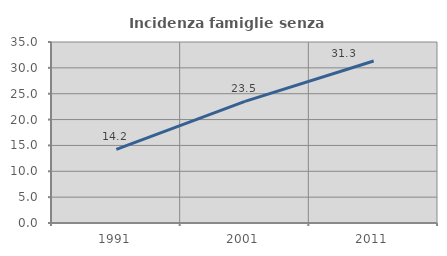
| Category | Incidenza famiglie senza nuclei |
|---|---|
| 1991.0 | 14.235 |
| 2001.0 | 23.529 |
| 2011.0 | 31.332 |